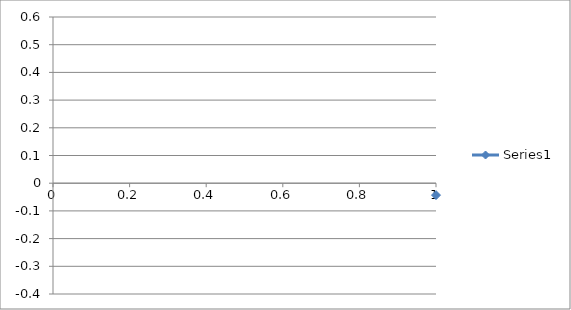
| Category | Series 0 |
|---|---|
| 0 | -0.043 |
| 1 | -0.04 |
| 2 | -0.029 |
| 3 | -0.029 |
| 4 | -0.026 |
| 5 | -0.032 |
| 6 | -0.042 |
| 7 | -0.039 |
| 8 | -0.026 |
| 9 | -0.015 |
| 10 | -0.012 |
| 11 | -0.014 |
| 12 | 0.002 |
| 13 | -0.008 |
| 14 | 0.001 |
| 15 | 0.009 |
| 16 | 0.015 |
| 17 | 0.029 |
| 18 | 0.035 |
| 19 | 0.037 |
| 20 | 0.035 |
| 21 | 0.039 |
| 22 | 0.049 |
| 23 | 0.05 |
| 24 | 0.058 |
| 25 | 0.055 |
| 26 | 0.064 |
| 27 | 0.065 |
| 28 | 0.072 |
| 29 | 0.075 |
| 30 | 0.083 |
| 31 | 0.08 |
| 32 | 0.092 |
| 33 | 0.096 |
| 34 | 0.094 |
| 35 | 0.097 |
| 36 | 0.112 |
| 37 | 0.11 |
| 38 | 0.11 |
| 39 | 0.128 |
| 40 | 0.144 |
| 41 | 0.157 |
| 42 | 0.158 |
| 43 | 0.155 |
| 44 | 0.171 |
| 45 | 0.193 |
| 46 | 0.192 |
| 47 | 0.209 |
| 48 | 0.229 |
| 49 | 0.241 |
| 50 | 0.253 |
| 51 | 0.277 |
| 52 | 0.29 |
| 53 | 0.319 |
| 54 | 0.33 |
| 55 | 0.342 |
| 56 | 0.354 |
| 57 | 0.363 |
| 58 | 0.365 |
| 59 | 0.381 |
| 60 | 0.41 |
| 61 | 0.437 |
| 62 | 0.451 |
| 63 | 0.465 |
| 64 | 0.465 |
| 65 | 0.478 |
| 66 | 0.488 |
| 67 | 0.482 |
| 68 | 0.473 |
| 69 | 0.464 |
| 70 | 0.452 |
| 71 | 0.442 |
| 72 | 0.427 |
| 73 | 0.423 |
| 74 | 0.391 |
| 75 | 0.351 |
| 76 | 0.317 |
| 77 | 0.276 |
| 78 | 0.235 |
| 79 | 0.184 |
| 80 | 0.137 |
| 81 | 0.075 |
| 82 | 0.008 |
| 83 | -0.019 |
| 84 | -0.053 |
| 85 | -0.097 |
| 86 | -0.139 |
| 87 | -0.162 |
| 88 | -0.186 |
| 89 | -0.205 |
| 90 | -0.236 |
| 91 | -0.232 |
| 92 | -0.233 |
| 93 | -0.243 |
| 94 | -0.248 |
| 95 | -0.259 |
| 96 | -0.269 |
| 97 | -0.266 |
| 98 | -0.257 |
| 99 | -0.25 |
| 100 | -0.235 |
| 101 | -0.23 |
| 102 | -0.205 |
| 103 | -0.191 |
| 104 | -0.185 |
| 105 | -0.169 |
| 106 | -0.134 |
| 107 | -0.119 |
| 108 | -0.108 |
| 109 | -0.084 |
| 110 | -0.063 |
| 111 | -0.049 |
| 112 | -0.029 |
| 113 | 0.003 |
| 114 | -0.003 |
| 115 | 0.02 |
| 116 | 0.05 |
| 117 | 0.075 |
| 118 | 0.061 |
| 119 | 0.078 |
| 120 | 0.103 |
| 121 | 0.094 |
| 122 | 0.102 |
| 123 | 0.105 |
| 124 | 0.117 |
| 125 | 0.135 |
| 126 | 0.144 |
| 127 | 0.161 |
| 128 | 0.172 |
| 129 | 0.182 |
| 130 | 0.19 |
| 131 | 0.186 |
| 132 | 0.184 |
| 133 | 0.211 |
| 134 | 0.213 |
| 135 | 0.213 |
| 136 | 0.208 |
| 137 | 0.191 |
| 138 | 0.209 |
| 139 | 0.206 |
| 140 | 0.21 |
| 141 | 0.197 |
| 142 | 0.209 |
| 143 | 0.232 |
| 144 | 0.223 |
| 145 | 0.236 |
| 146 | 0.237 |
| 147 | 0.227 |
| 148 | 0.227 |
| 149 | 0.243 |
| 150 | 0.231 |
| 151 | 0.232 |
| 152 | 0.233 |
| 153 | 0.229 |
| 154 | 0.213 |
| 155 | 0.219 |
| 156 | 0.23 |
| 157 | 0.231 |
| 158 | 0.228 |
| 159 | 0.237 |
| 160 | 0.234 |